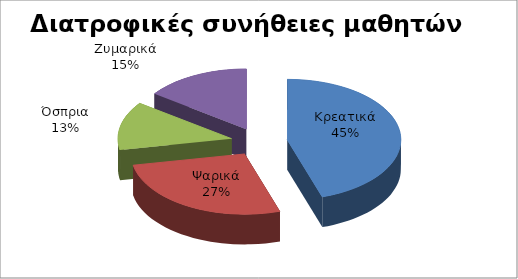
| Category | Series 0 | Series 1 | Series 2 |
|---|---|---|---|
| Κρεατικά |  | 45 |  |
| Ψαρικά |  | 27 |  |
| Όσπρια |  | 13 |  |
| Ζυμαρικά |  | 15 |  |